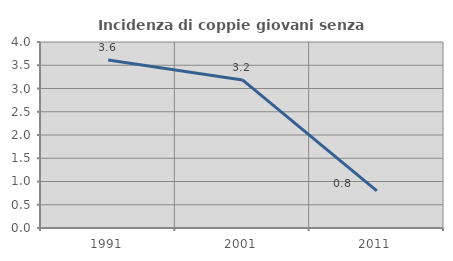
| Category | Incidenza di coppie giovani senza figli |
|---|---|
| 1991.0 | 3.614 |
| 2001.0 | 3.185 |
| 2011.0 | 0.8 |